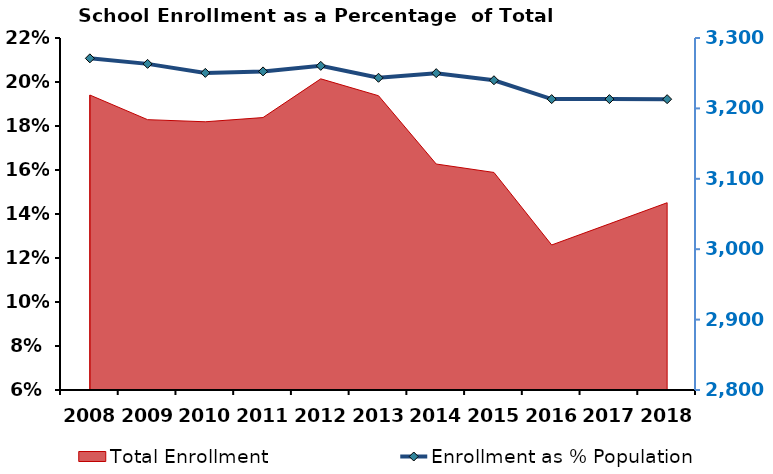
| Category | Enrollment as % Population |
|---|---|
| 0 | 0.211 |
| 1 | 0.208 |
| 2 | 0.204 |
| 3 | 0.205 |
| 4 | 0.207 |
| 5 | 0.202 |
| 6 | 0.204 |
| 7 | 0.201 |
| 8 | 0.192 |
| 9 | 0.192 |
| 10 | 0.192 |